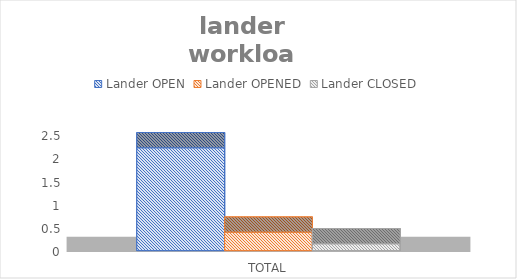
| Category | Lander |
|---|---|
| TOTAL | 0.148 |